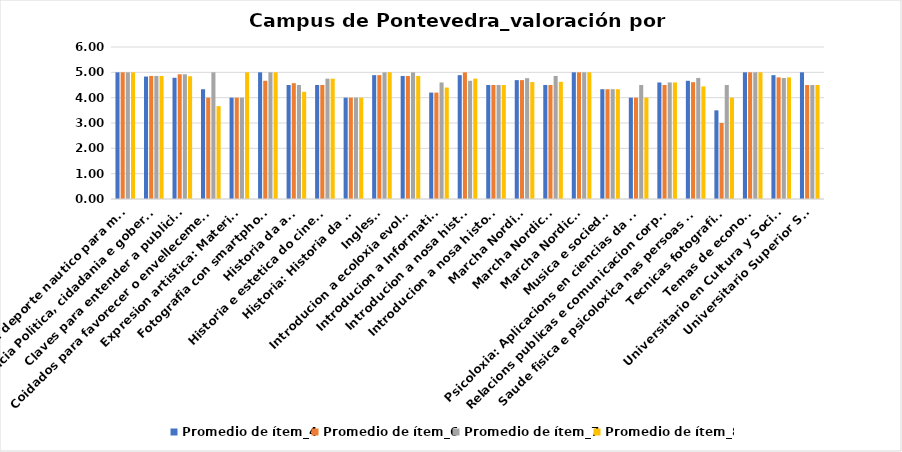
| Category | Promedio de ítem_4 | Promedio de ítem_6 | Promedio de ítem_7 | Promedio de ítem_8 |
|---|---|---|---|---|
| Barco Dragon: deporte nautico para maiores | 5 | 5 | 5 | 5 |
| Ciencia Politica, cidadania e gobernanza | 4.833 | 4.857 | 4.857 | 4.857 |
| Claves para entender a publicidade | 4.786 | 4.923 | 4.923 | 4.846 |
| Coidados para favorecer o envellecemento activo e saudable | 4.333 | 4 | 5 | 3.667 |
| Expresion artistica: Materia-Cor | 4 | 4 | 4 | 5 |
| Fotografia con smartphone II | 5 | 4.667 | 5 | 5 |
| Historia da arte | 4.5 | 4.571 | 4.5 | 4.231 |
| Historia e estetica do cinema II | 4.5 | 4.5 | 4.75 | 4.75 |
| Historia: Historia da arte | 4 | 4 | 4 | 4 |
| Ingles II | 4.889 | 4.889 | 5 | 5 |
| Introducion a ecoloxia evolutiva | 4.857 | 4.857 | 5 | 4.857 |
| Introducion a Informatica II | 4.2 | 4.2 | 4.6 | 4.4 |
| Introducion a nosa historia I | 4.889 | 5 | 4.667 | 4.75 |
| Introducion a nosa historia II | 4.5 | 4.5 | 4.5 | 4.5 |
| Marcha Nordica I | 4.692 | 4.692 | 4.769 | 4.615 |
| Marcha Nordica II | 4.5 | 4.5 | 4.857 | 4.625 |
| Marcha Nordica III | 5 | 5 | 5 | 5 |
| Musica e sociedade | 4.333 | 4.333 | 4.333 | 4.333 |
| Psicoloxia: Aplicacions en ciencias da saude | 4 | 4 | 4.5 | 4 |
| Relacions publicas e comunicacion corporativa | 4.6 | 4.5 | 4.6 | 4.6 |
| Saude fisica e psicoloxica nas persoas adultas maiores | 4.667 | 4.611 | 4.778 | 4.444 |
| Tecnicas fotograficas | 3.5 | 3 | 4.5 | 4 |
| Temas de economia | 5 | 5 | 5 | 5 |
| Universitario en Cultura y Sociedad | 4.889 | 4.8 | 4.778 | 4.8 |
| Universitario Superior Senior | 5 | 4.5 | 4.5 | 4.5 |